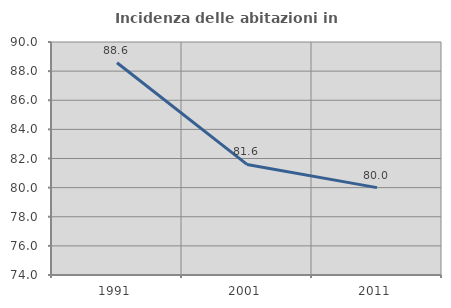
| Category | Incidenza delle abitazioni in proprietà  |
|---|---|
| 1991.0 | 88.571 |
| 2001.0 | 81.592 |
| 2011.0 | 80 |